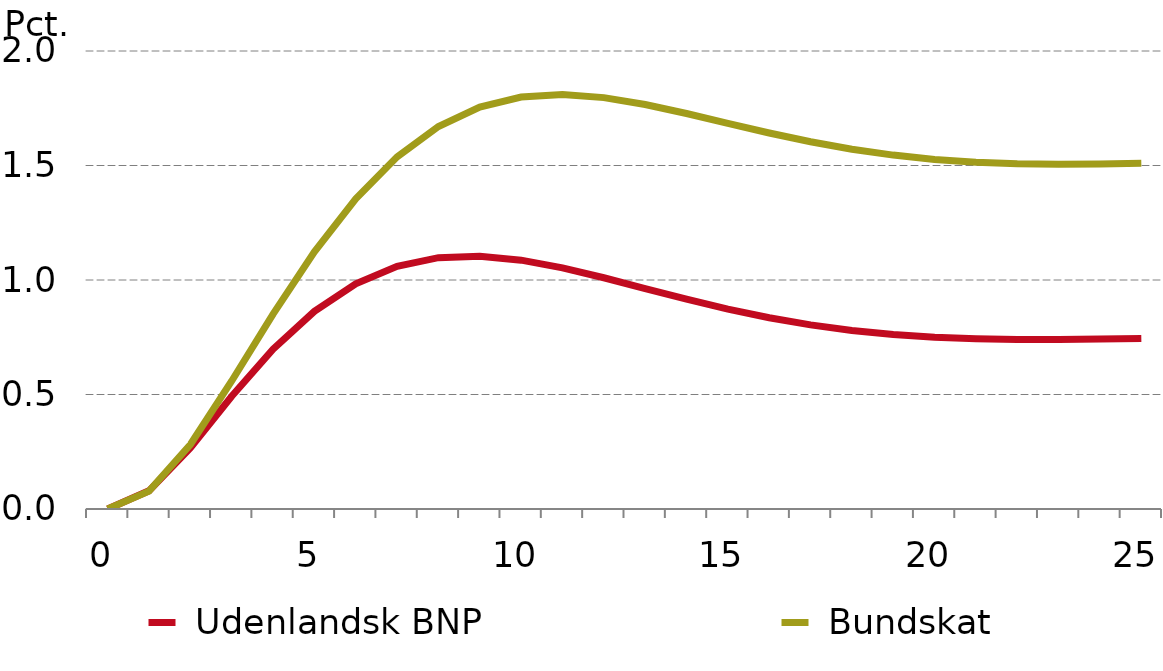
| Category |  Udenlandsk BNP |  Bundskat |
|---|---|---|
| 0.0 | 0 | 0 |
| nan | 0.079 | 0.078 |
| nan | 0.267 | 0.282 |
| nan | 0.492 | 0.559 |
| nan | 0.698 | 0.851 |
| 5.0 | 0.863 | 1.123 |
| nan | 0.983 | 1.355 |
| nan | 1.06 | 1.538 |
| nan | 1.097 | 1.67 |
| nan | 1.104 | 1.755 |
| 10.0 | 1.087 | 1.799 |
| nan | 1.053 | 1.81 |
| nan | 1.01 | 1.796 |
| nan | 0.963 | 1.766 |
| nan | 0.916 | 1.727 |
| 15.0 | 0.873 | 1.684 |
| nan | 0.835 | 1.642 |
| nan | 0.804 | 1.604 |
| nan | 0.78 | 1.571 |
| nan | 0.762 | 1.545 |
| 20.0 | 0.75 | 1.527 |
| nan | 0.743 | 1.514 |
| nan | 0.74 | 1.507 |
| nan | 0.74 | 1.505 |
| nan | 0.742 | 1.506 |
| 25.0 | 0.745 | 1.51 |